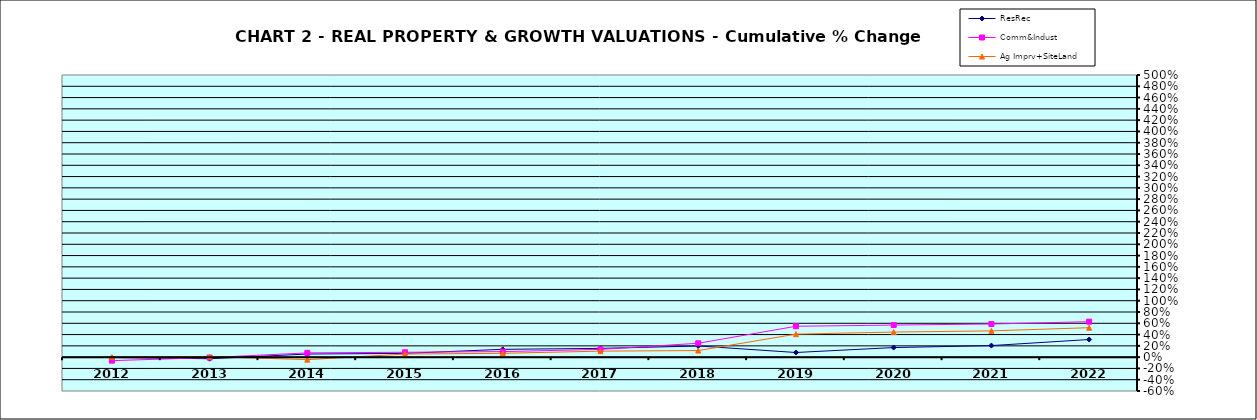
| Category | ResRec | Comm&Indust | Ag Imprv+SiteLand |
|---|---|---|---|
| 2012.0 | -0.007 | -0.062 | 0 |
| 2013.0 | -0.028 | -0.008 | 0.011 |
| 2014.0 | 0.055 | 0.075 | -0.045 |
| 2015.0 | 0.067 | 0.086 | 0.055 |
| 2016.0 | 0.139 | 0.098 | 0.068 |
| 2017.0 | 0.155 | 0.137 | 0.107 |
| 2018.0 | 0.198 | 0.246 | 0.117 |
| 2019.0 | 0.082 | 0.547 | 0.407 |
| 2020.0 | 0.17 | 0.568 | 0.444 |
| 2021.0 | 0.205 | 0.587 | 0.466 |
| 2022.0 | 0.312 | 0.628 | 0.522 |